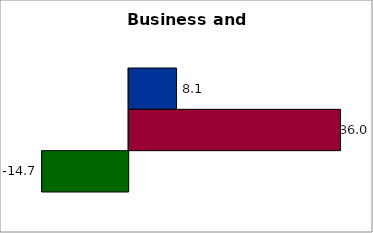
| Category | 50 states and D.C. | SREB states | State |
|---|---|---|---|
| 0 | 8.133 | 36.005 | -14.706 |